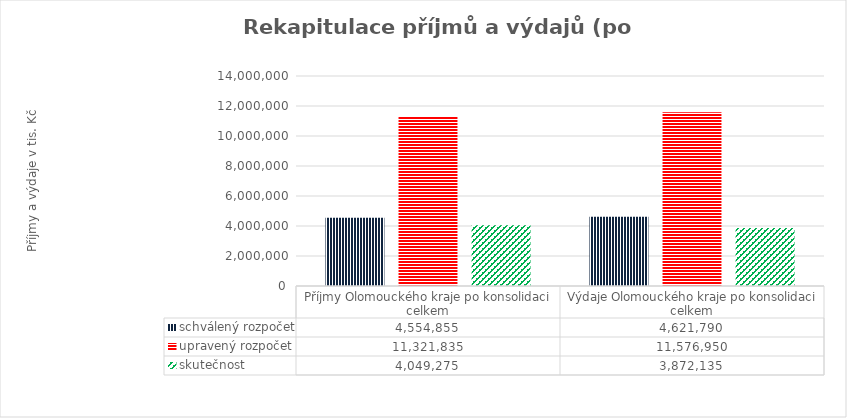
| Category | schválený rozpočet | upravený rozpočet | skutečnost |
|---|---|---|---|
| Příjmy Olomouckého kraje po konsolidaci celkem | 4554855 | 11321835 | 4049275 |
| Výdaje Olomouckého kraje po konsolidaci celkem | 4621790 | 11576950 | 3872135 |